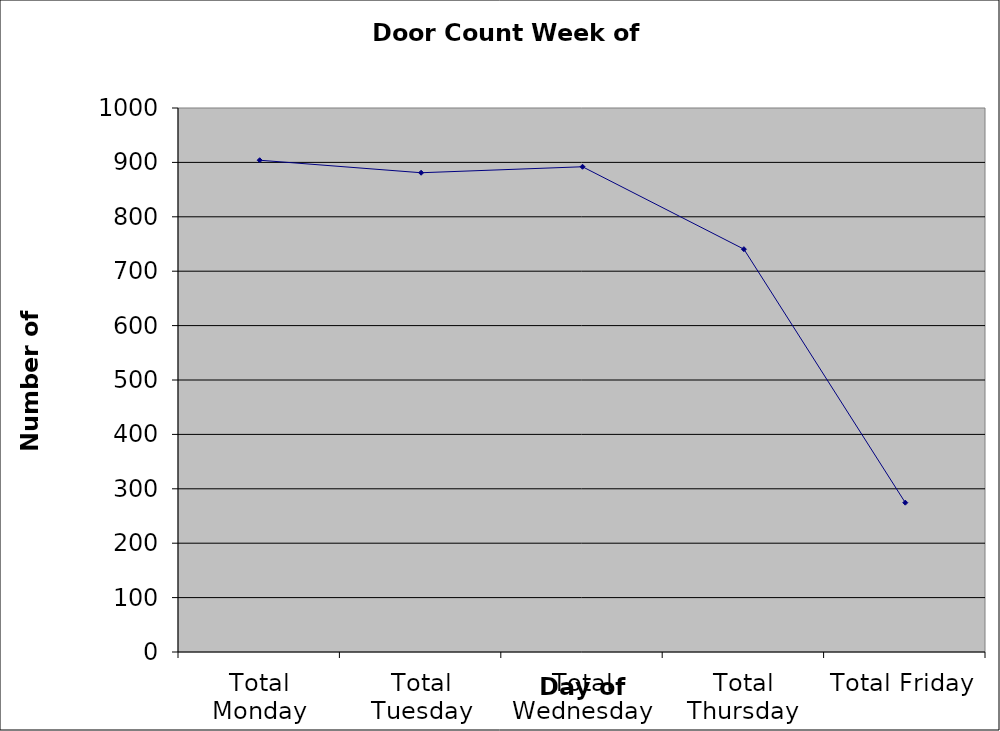
| Category | Series 0 |
|---|---|
| Total Monday | 904 |
| Total Tuesday | 881 |
| Total Wednesday | 892 |
| Total Thursday | 740.5 |
| Total Friday | 274.5 |